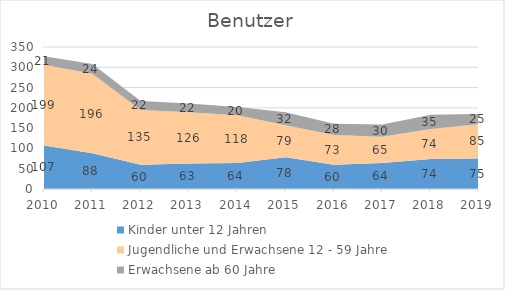
| Category | Kinder unter 12 Jahren | Jugendliche und Erwachsene 12 - 59 Jahre | Erwachsene ab 60 Jahre |
|---|---|---|---|
| 2010.0 | 107 | 199 | 21 |
| 2011.0 | 88 | 196 | 24 |
| 2012.0 | 60 | 135 | 22 |
| 2013.0 | 63 | 126 | 22 |
| 2014.0 | 64 | 118 | 20 |
| 2015.0 | 78 | 79 | 32 |
| 2016.0 | 60 | 73 | 28 |
| 2017.0 | 64 | 65 | 30 |
| 2018.0 | 74 | 74 | 35 |
| 2019.0 | 75 | 85 | 25 |